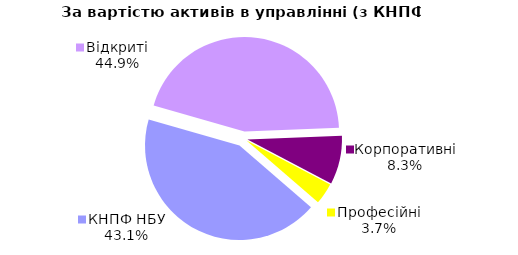
| Category | Series 0 |
|---|---|
| Відкриті | 2012.661 |
| Корпоративні | 372.823 |
| Професійні | 163.511 |
| КНПФ НБУ | 1930.356 |